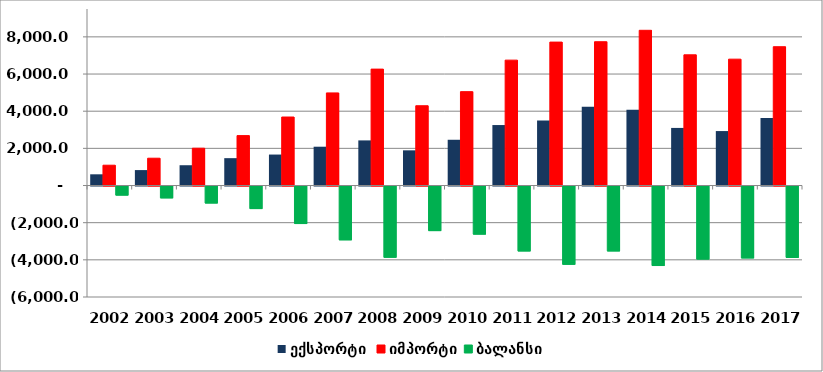
| Category | ექსპორტი  | იმპორტი | ბალანსი |
|---|---|---|---|
| 2002.0 | 603.334 | 1092.525 | -489.191 |
| 2003.0 | 830.555 | 1469.169 | -638.614 |
| 2004.0 | 1092.111 | 2007.734 | -915.622 |
| 2005.0 | 1472.437 | 2686.341 | -1213.903 |
| 2006.0 | 1666.526 | 3685.88 | -2019.354 |
| 2007.0 | 2088.285 | 4984.11 | -2895.825 |
| 2008.0 | 2427.979 | 6264.175 | -3836.196 |
| 2009.0 | 1893.602 | 4293.454 | -2399.852 |
| 2010.0 | 2462.202 | 5052.275 | -2590.074 |
| 2011.0 | 3254.492 | 6748.31 | -3493.818 |
| 2012.0 | 3502.319 | 7718.323 | -4216.003 |
| 2013.0 | 4245.762 | 7738.396 | -3492.634 |
| 2014.0 | 4073.415 | 8353.704 | -4280.289 |
| 2015.0 | 3099.467 | 7033.992 | -3934.525 |
| 2016.0 | 2930.68 | 6799.861 | -3869.181 |
| 2017.0 | 3629.999 | 7470.689 | -3840.691 |